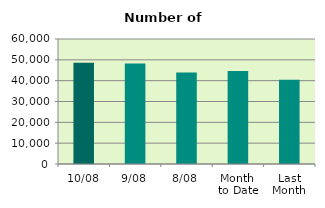
| Category | Series 0 |
|---|---|
| 10/08 | 48628 |
| 9/08 | 48260 |
| 8/08 | 43882 |
| Month 
to Date | 44696 |
| Last
Month | 40410.857 |